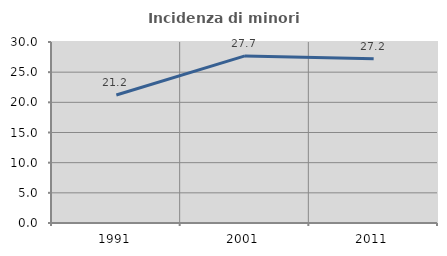
| Category | Incidenza di minori stranieri |
|---|---|
| 1991.0 | 21.212 |
| 2001.0 | 27.692 |
| 2011.0 | 27.225 |